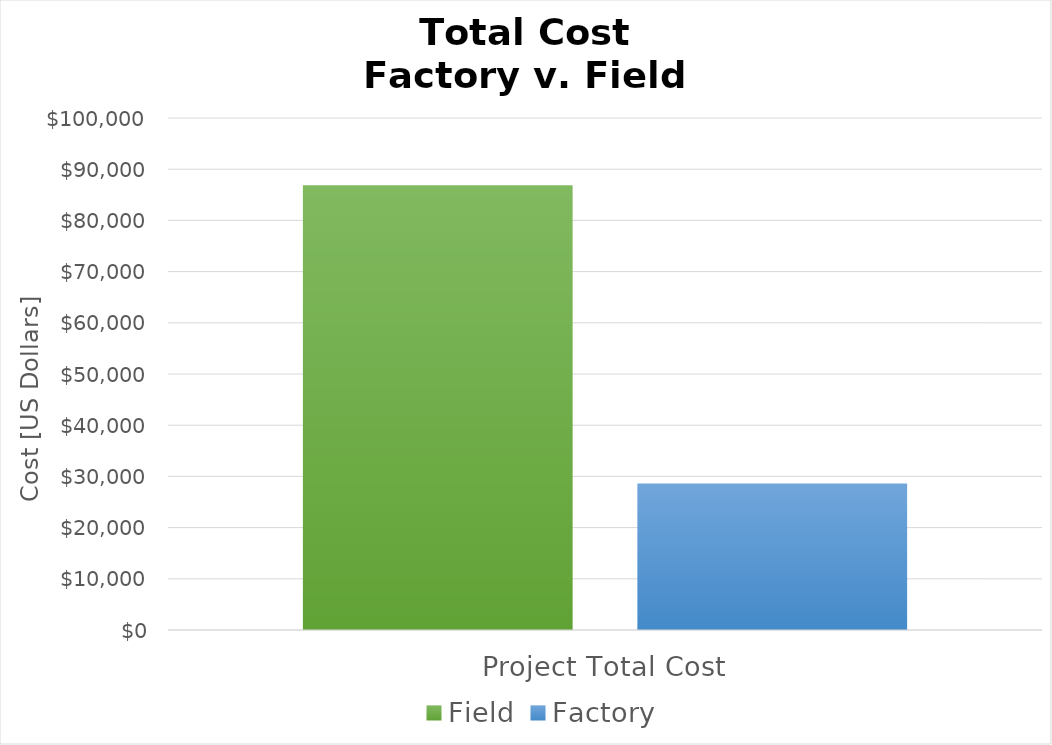
| Category | Field | Factory |
|---|---|---|
| Project Total Cost | 86880.864 | 28634.306 |